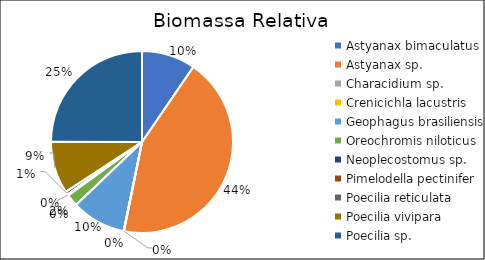
| Category | Series 0 |
|---|---|
| Astyanax bimaculatus | 0.095 |
| Astyanax sp. | 0.436 |
| Characidium sp. | 0 |
| Crenicichla lacustris | 0.001 |
| Geophagus brasiliensis | 0.096 |
| Oreochromis niloticus | 0.022 |
| Neoplecostomus sp. | 0.002 |
| Pimelodella pectinifer | 0 |
| Poecilia reticulata | 0.006 |
| Poecilia vivipara | 0.092 |
| Poecilia sp. | 0.25 |